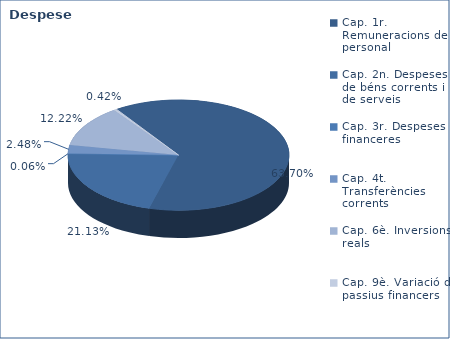
| Category | Series 0 |
|---|---|
| Cap. 1r. Remuneracions de personal | 222226566 |
| Cap. 2n. Despeses de béns corrents i de serveis | 73709960 |
| Cap. 3r. Despeses financeres | 196290 |
| Cap. 4t. Transferències corrents | 8651418 |
| Cap. 6è. Inversions reals | 42623859 |
| Cap. 9è. Variació de passius financers | 1455084 |